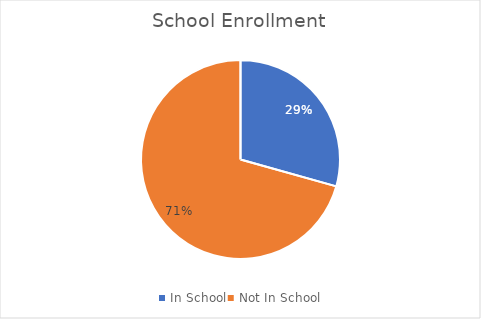
| Category | Series 0 |
|---|---|
| In School | 0.293 |
| Not In School | 0.707 |